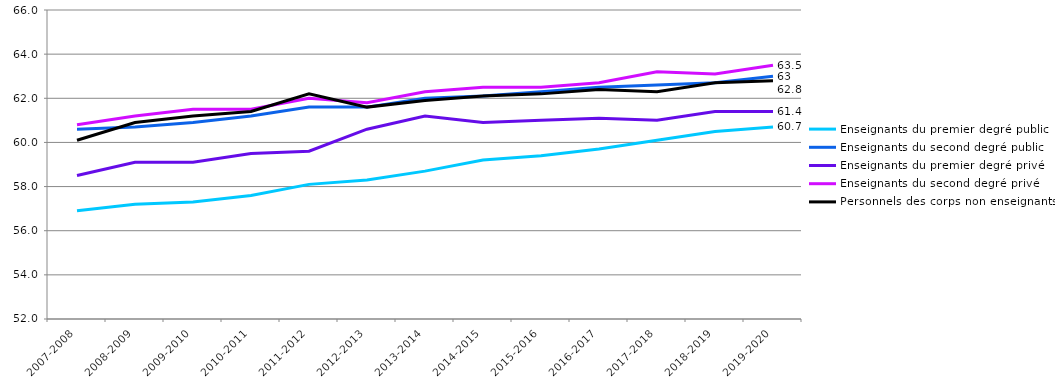
| Category | Enseignants du premier degré public | Enseignants du second degré public | Enseignants du premier degré privé | Enseignants du second degré privé | Personnels des corps non enseignants  |
|---|---|---|---|---|---|
| 2007-2008 | 56.9 | 60.6 | 58.5 | 60.8 | 60.1 |
| 2008-2009 | 57.2 | 60.7 | 59.1 | 61.2 | 60.9 |
| 2009-2010 | 57.3 | 60.9 | 59.1 | 61.5 | 61.2 |
| 2010-2011 | 57.6 | 61.2 | 59.5 | 61.5 | 61.4 |
| 2011-2012 | 58.1 | 61.6 | 59.6 | 62 | 62.2 |
| 2012-2013 | 58.3 | 61.6 | 60.6 | 61.8 | 61.6 |
| 2013-2014 | 58.7 | 62 | 61.2 | 62.3 | 61.9 |
| 2014-2015 | 59.2 | 62.1 | 60.9 | 62.5 | 62.1 |
| 2015-2016 | 59.4 | 62.3 | 61 | 62.5 | 62.2 |
| 2016-2017 | 59.7 | 62.5 | 61.1 | 62.7 | 62.4 |
| 2017-2018 | 60.1 | 62.6 | 61 | 63.2 | 62.3 |
| 2018-2019 | 60.5 | 62.7 | 61.4 | 63.1 | 62.7 |
| 2019-2020 | 60.7 | 63 | 61.4 | 63.5 | 62.8 |